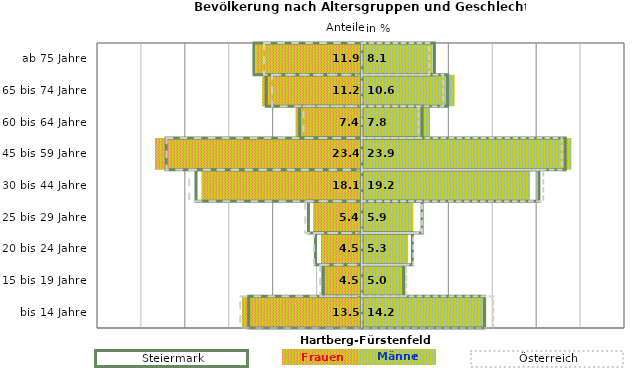
| Category | Frauen | Männer | Frauen Spalte2 | Männer Spalte2 | Frauen Spalte3 | Männer Spalte3 |
|---|---|---|---|---|---|---|
| bis 14 Jahre | -13.5 | 14.2 | 14 | -12.9 | -13.8 | 15 |
| 15 bis 19 Jahre | -4.5 | 5 | 4.8 | -4.4 | -4.7 | 5.1 |
| 20 bis 24 Jahre | -4.5 | 5.3 | 5.8 | -5.3 | -5.4 | 5.9 |
| 25 bis 29 Jahre | -5.4 | 5.9 | 6.9 | -6.1 | -6.4 | 6.9 |
| 30 bis 44 Jahre | -18.1 | 19.2 | 20.2 | -18.9 | -19.6 | 20.7 |
| 45 bis 59 Jahre | -23.4 | 23.9 | 23.2 | -22.3 | -22.2 | 22.8 |
| 60 bis 64 Jahre | -7.4 | 7.8 | 6.9 | -7.1 | -6.6 | 6.5 |
| 65 bis 74 Jahre | -11.2 | 10.6 | 9.8 | -10.9 | -10.2 | 9.3 |
| ab 75 Jahre | -11.9 | 8.1 | 8.3 | -12.3 | -11.1 | 7.7 |